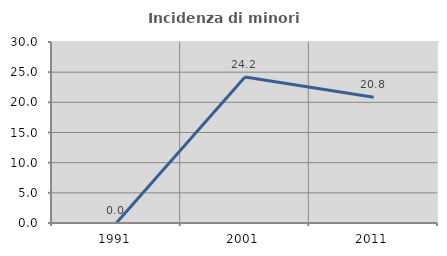
| Category | Incidenza di minori stranieri |
|---|---|
| 1991.0 | 0 |
| 2001.0 | 24.194 |
| 2011.0 | 20.833 |